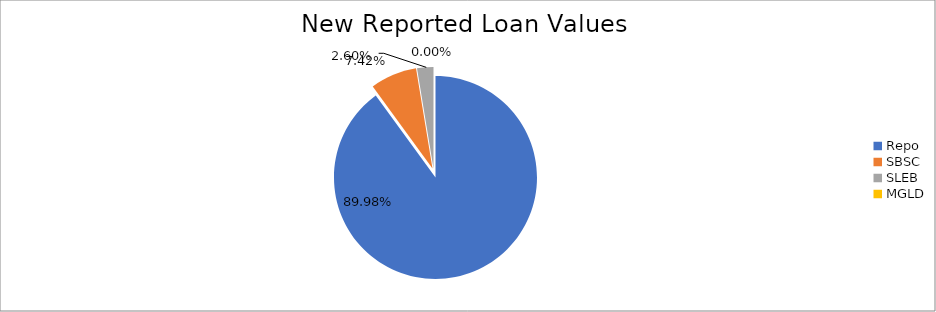
| Category | Series 0 |
|---|---|
| Repo | 11602025.942 |
| SBSC | 956951.664 |
| SLEB | 334641.559 |
| MGLD | 329.992 |